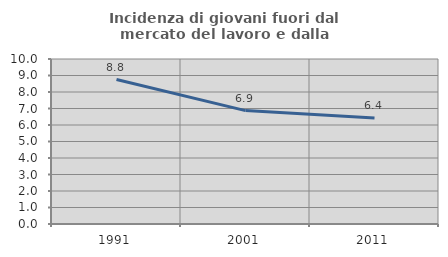
| Category | Incidenza di giovani fuori dal mercato del lavoro e dalla formazione  |
|---|---|
| 1991.0 | 8.755 |
| 2001.0 | 6.873 |
| 2011.0 | 6.427 |